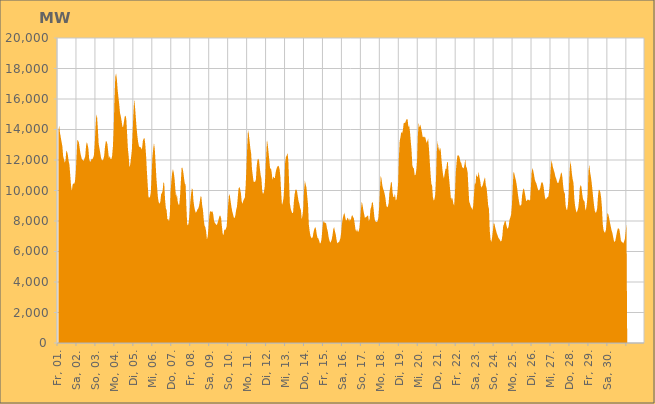
| Category | Series 0 |
|---|---|
|  Fr, 01.  | 13878.793 |
|  Fr, 01.  | 14262.089 |
|  Fr, 01.  | 13782.547 |
|  Fr, 01.  | 13492.274 |
|  Fr, 01.  | 13186.011 |
|  Fr, 01.  | 12915.115 |
|  Fr, 01.  | 12270.235 |
|  Fr, 01.  | 12058.289 |
|  Fr, 01.  | 11834.694 |
|  Fr, 01.  | 11949.019 |
|  Fr, 01.  | 12615.522 |
|  Fr, 01.  | 12539.215 |
|  Fr, 01.  | 12303.45 |
|  Fr, 01.  | 11924.206 |
|  Fr, 01.  | 11681.577 |
|  Fr, 01.  | 10993.734 |
|  Fr, 01.  | 10318.427 |
|  Sa, 02.  | 9981.906 |
|  Sa, 02.  | 10382.912 |
|  Sa, 02.  | 10466.688 |
|  Sa, 02.  | 10435.873 |
|  Sa, 02.  | 10596.642 |
|  Sa, 02.  | 11151.329 |
|  Sa, 02.  | 12265.621 |
|  Sa, 02.  | 13314.695 |
|  Sa, 02.  | 13261.381 |
|  Sa, 02.  | 13134.635 |
|  Sa, 02.  | 12749.764 |
|  Sa, 02.  | 12414.04 |
|  Sa, 02.  | 12193.676 |
|  Sa, 02.  | 12012.183 |
|  Sa, 02.  | 12009.718 |
|  Sa, 02.  | 11931.716 |
|  Sa, 02.  | 12099.205 |
|  Sa, 02.  | 12253.586 |
|  Sa, 02.  | 12917.688 |
|  Sa, 02.  | 13173.444 |
|  Sa, 02.  | 13007.349 |
|  Sa, 02.  | 12726.204 |
|  Sa, 02.  | 12055.014 |
|  Sa, 02.  | 11893.258 |
|  So, 03.  | 11910.158 |
|  So, 03.  | 12078.958 |
|  So, 03.  | 12052.947 |
|  So, 03.  | 12148.504 |
|  So, 03.  | 12324.542 |
|  So, 03.  | 13039.832 |
|  So, 03.  | 14130.231 |
|  So, 03.  | 14980.438 |
|  So, 03.  | 14805.828 |
|  So, 03.  | 14010.862 |
|  So, 03.  | 13047.624 |
|  So, 03.  | 12769.039 |
|  So, 03.  | 12459.73 |
|  So, 03.  | 12144.59 |
|  So, 03.  | 11993.905 |
|  So, 03.  | 11982.427 |
|  So, 03.  | 12061.313 |
|  So, 03.  | 12308.702 |
|  So, 03.  | 12871.593 |
|  So, 03.  | 13223.526 |
|  So, 03.  | 13226.489 |
|  So, 03.  | 13049.692 |
|  So, 03.  | 12576.939 |
|  So, 03.  | 12108.018 |
|  Mo, 04.  | 12264.677 |
|  Mo, 04.  | 12073.759 |
|  Mo, 04.  | 12056.805 |
|  Mo, 04.  | 12269.654 |
|  Mo, 04.  | 12882.707 |
|  Mo, 04.  | 14029.754 |
|  Mo, 04.  | 16017.393 |
|  Mo, 04.  | 17440.187 |
|  Mo, 04.  | 17683.174 |
|  Mo, 04.  | 17305.194 |
|  Mo, 04.  | 16607.957 |
|  Mo, 04.  | 16112.009 |
|  Mo, 04.  | 15649.054 |
|  Mo, 04.  | 15084.479 |
|  Mo, 04.  | 14859.195 |
|  Mo, 04.  | 14563.18 |
|  Mo, 04.  | 14182.592 |
|  Mo, 04.  | 14190.996 |
|  Mo, 04.  | 14517.901 |
|  Mo, 04.  | 14862.607 |
|  Mo, 04.  | 14918.051 |
|  Mo, 04.  | 14663.811 |
|  Mo, 04.  | 13697.328 |
|  Mo, 04.  | 12727.929 |
|  Di, 05.  | 12228.867 |
|  Di, 05.  | 11506.846 |
|  Di, 05.  | 11730.004 |
|  Di, 05.  | 12176.565 |
|  Di, 05.  | 12666.622 |
|  Di, 05.  | 13823.826 |
|  Di, 05.  | 15109.323 |
|  Di, 05.  | 15992.574 |
|  Di, 05.  | 15475.127 |
|  Di, 05.  | 14792.501 |
|  Di, 05.  | 14093.08 |
|  Di, 05.  | 13560.743 |
|  Di, 05.  | 13150.553 |
|  Di, 05.  | 12902.079 |
|  Di, 05.  | 12844.833 |
|  Di, 05.  | 12849.245 |
|  Di, 05.  | 12686.327 |
|  Di, 05.  | 12820.287 |
|  Di, 05.  | 13276.552 |
|  Di, 05.  | 13403.366 |
|  Di, 05.  | 13446.459 |
|  Di, 05.  | 13015.502 |
|  Di, 05.  | 12278.566 |
|  Di, 05.  | 11284.537 |
|  Mi, 06.  | 10424.678 |
|  Mi, 06.  | 9568.597 |
|  Mi, 06.  | 9530.845 |
|  Mi, 06.  | 9593.707 |
|  Mi, 06.  | 9879.379 |
|  Mi, 06.  | 10999.829 |
|  Mi, 06.  | 12201.949 |
|  Mi, 06.  | 12727.245 |
|  Mi, 06.  | 13124.298 |
|  Mi, 06.  | 12722.66 |
|  Mi, 06.  | 11855.66 |
|  Mi, 06.  | 10848.044 |
|  Mi, 06.  | 10173.688 |
|  Mi, 06.  | 9539.435 |
|  Mi, 06.  | 9228.161 |
|  Mi, 06.  | 9129.29 |
|  Mi, 06.  | 9260.17 |
|  Mi, 06.  | 9749.862 |
|  Mi, 06.  | 9836.662 |
|  Mi, 06.  | 10007.643 |
|  Mi, 06.  | 10570.447 |
|  Mi, 06.  | 10427.928 |
|  Mi, 06.  | 9416.909 |
|  Mi, 06.  | 8848.229 |
|  Do, 07.  | 8701.875 |
|  Do, 07.  | 8103.437 |
|  Do, 07.  | 8125.535 |
|  Do, 07.  | 7971.061 |
|  Do, 07.  | 8405.177 |
|  Do, 07.  | 9885.666 |
|  Do, 07.  | 10628.002 |
|  Do, 07.  | 11153.055 |
|  Do, 07.  | 11407.858 |
|  Do, 07.  | 11181.69 |
|  Do, 07.  | 10802.987 |
|  Do, 07.  | 10103.674 |
|  Do, 07.  | 9551.231 |
|  Do, 07.  | 9786.629 |
|  Do, 07.  | 9279.701 |
|  Do, 07.  | 9080.235 |
|  Do, 07.  | 9064.378 |
|  Do, 07.  | 9640.77 |
|  Do, 07.  | 10583.376 |
|  Do, 07.  | 11497.835 |
|  Do, 07.  | 11490.909 |
|  Do, 07.  | 11234.279 |
|  Do, 07.  | 10833.091 |
|  Do, 07.  | 10464.702 |
|  Fr, 08.  | 10380.371 |
|  Fr, 08.  | 8982.181 |
|  Fr, 08.  | 7785.064 |
|  Fr, 08.  | 7712.164 |
|  Fr, 08.  | 7916.336 |
|  Fr, 08.  | 8534.893 |
|  Fr, 08.  | 9265.348 |
|  Fr, 08.  | 9788.531 |
|  Fr, 08.  | 10139.305 |
|  Fr, 08.  | 10061.86 |
|  Fr, 08.  | 9311.184 |
|  Fr, 08.  | 8927.985 |
|  Fr, 08.  | 8674.39 |
|  Fr, 08.  | 8540.923 |
|  Fr, 08.  | 8619.9 |
|  Fr, 08.  | 8760.059 |
|  Fr, 08.  | 8818.282 |
|  Fr, 08.  | 8970.893 |
|  Fr, 08.  | 9287.665 |
|  Fr, 08.  | 9620.15 |
|  Fr, 08.  | 9583.345 |
|  Fr, 08.  | 9027.834 |
|  Fr, 08.  | 8720.358 |
|  Fr, 08.  | 8074.746 |
|  Sa, 09.  | 7694.762 |
|  Sa, 09.  | 7607.412 |
|  Sa, 09.  | 7306.518 |
|  Sa, 09.  | 6783.632 |
|  Sa, 09.  | 6980.554 |
|  Sa, 09.  | 7564.844 |
|  Sa, 09.  | 8325.684 |
|  Sa, 09.  | 8653.022 |
|  Sa, 09.  | 8599.771 |
|  Sa, 09.  | 8606.216 |
|  Sa, 09.  | 8639.487 |
|  Sa, 09.  | 8425.367 |
|  Sa, 09.  | 8024.201 |
|  Sa, 09.  | 7875.035 |
|  Sa, 09.  | 7824.452 |
|  Sa, 09.  | 7726.695 |
|  Sa, 09.  | 7797.543 |
|  Sa, 09.  | 7948.087 |
|  Sa, 09.  | 8163.895 |
|  Sa, 09.  | 8341.718 |
|  Sa, 09.  | 8353.35 |
|  Sa, 09.  | 8168.707 |
|  Sa, 09.  | 7639.524 |
|  Sa, 09.  | 7147.979 |
|  So, 10.  | 7075.109 |
|  So, 10.  | 7439.843 |
|  So, 10.  | 7407.064 |
|  So, 10.  | 7490.918 |
|  So, 10.  | 7657.119 |
|  So, 10.  | 8331.148 |
|  So, 10.  | 9153.716 |
|  So, 10.  | 9764.235 |
|  So, 10.  | 9659.255 |
|  So, 10.  | 9304.538 |
|  So, 10.  | 8942.842 |
|  So, 10.  | 8638.061 |
|  So, 10.  | 8450.774 |
|  So, 10.  | 8229.961 |
|  So, 10.  | 8187.343 |
|  So, 10.  | 8362.675 |
|  So, 10.  | 8724.143 |
|  So, 10.  | 8926.71 |
|  So, 10.  | 9504.825 |
|  So, 10.  | 10116.502 |
|  So, 10.  | 10240.33 |
|  So, 10.  | 10101.506 |
|  So, 10.  | 9809.419 |
|  So, 10.  | 9290.476 |
|  Mo, 11.  | 9123.875 |
|  Mo, 11.  | 9322.253 |
|  Mo, 11.  | 9446.824 |
|  Mo, 11.  | 9528.029 |
|  Mo, 11.  | 10290.374 |
|  Mo, 11.  | 11450.181 |
|  Mo, 11.  | 12825.83 |
|  Mo, 11.  | 13973.389 |
|  Mo, 11.  | 13718.21 |
|  Mo, 11.  | 13233.425 |
|  Mo, 11.  | 12761.831 |
|  Mo, 11.  | 12415.3 |
|  Mo, 11.  | 11422.371 |
|  Mo, 11.  | 11009.799 |
|  Mo, 11.  | 10591.064 |
|  Mo, 11.  | 10559.94 |
|  Mo, 11.  | 10576.133 |
|  Mo, 11.  | 10727.268 |
|  Mo, 11.  | 11593.619 |
|  Mo, 11.  | 12014.872 |
|  Mo, 11.  | 12091.426 |
|  Mo, 11.  | 11945.319 |
|  Mo, 11.  | 11451.173 |
|  Mo, 11.  | 11015.615 |
|  Di, 12.  | 10763.218 |
|  Di, 12.  | 9984.882 |
|  Di, 12.  | 9766.249 |
|  Di, 12.  | 9883.425 |
|  Di, 12.  | 10194.086 |
|  Di, 12.  | 11027.584 |
|  Di, 12.  | 12258.612 |
|  Di, 12.  | 13338.929 |
|  Di, 12.  | 12996.822 |
|  Di, 12.  | 12504.914 |
|  Di, 12.  | 11973.752 |
|  Di, 12.  | 11409.624 |
|  Di, 12.  | 11483.176 |
|  Di, 12.  | 11170.59 |
|  Di, 12.  | 10678.929 |
|  Di, 12.  | 10927.118 |
|  Di, 12.  | 10816.101 |
|  Di, 12.  | 10829.742 |
|  Di, 12.  | 11191.431 |
|  Di, 12.  | 11407.593 |
|  Di, 12.  | 11547.532 |
|  Di, 12.  | 11628.586 |
|  Di, 12.  | 11587.066 |
|  Di, 12.  | 11391.262 |
|  Mi, 13.  | 10884.308 |
|  Mi, 13.  | 9850.574 |
|  Mi, 13.  | 9047.109 |
|  Mi, 13.  | 9224.856 |
|  Mi, 13.  | 9524.16 |
|  Mi, 13.  | 10418.439 |
|  Mi, 13.  | 11830.568 |
|  Mi, 13.  | 12203.712 |
|  Mi, 13.  | 12289.993 |
|  Mi, 13.  | 12470.162 |
|  Mi, 13.  | 12004.8 |
|  Mi, 13.  | 10550.582 |
|  Mi, 13.  | 9151.515 |
|  Mi, 13.  | 8824.879 |
|  Mi, 13.  | 8643.314 |
|  Mi, 13.  | 8525.215 |
|  Mi, 13.  | 8532.066 |
|  Mi, 13.  | 9223.12 |
|  Mi, 13.  | 9743.19 |
|  Mi, 13.  | 10043.684 |
|  Mi, 13.  | 10068.863 |
|  Mi, 13.  | 9973.336 |
|  Mi, 13.  | 9626.043 |
|  Mi, 13.  | 9306.637 |
|  Do, 14.  | 9131.103 |
|  Do, 14.  | 8852.848 |
|  Do, 14.  | 8713.074 |
|  Do, 14.  | 8104.138 |
|  Do, 14.  | 8397.09 |
|  Do, 14.  | 8826.412 |
|  Do, 14.  | 10052.652 |
|  Do, 14.  | 10648.408 |
|  Do, 14.  | 10390 |
|  Do, 14.  | 10185.86 |
|  Do, 14.  | 9602.249 |
|  Do, 14.  | 9056.028 |
|  Do, 14.  | 7762.339 |
|  Do, 14.  | 7338.079 |
|  Do, 14.  | 7029.397 |
|  Do, 14.  | 6918.846 |
|  Do, 14.  | 6868.352 |
|  Do, 14.  | 6968.201 |
|  Do, 14.  | 7289.105 |
|  Do, 14.  | 7479.787 |
|  Do, 14.  | 7608.573 |
|  Do, 14.  | 7484.837 |
|  Do, 14.  | 7139.466 |
|  Do, 14.  | 6894.924 |
|  Fr, 15.  | 6858.177 |
|  Fr, 15.  | 6711.761 |
|  Fr, 15.  | 6529.647 |
|  Fr, 15.  | 6560.545 |
|  Fr, 15.  | 6792.334 |
|  Fr, 15.  | 7373.721 |
|  Fr, 15.  | 7872.925 |
|  Fr, 15.  | 8010.175 |
|  Fr, 15.  | 7879.237 |
|  Fr, 15.  | 7893.723 |
|  Fr, 15.  | 7823.88 |
|  Fr, 15.  | 7513.152 |
|  Fr, 15.  | 7313.953 |
|  Fr, 15.  | 6957.832 |
|  Fr, 15.  | 6733.066 |
|  Fr, 15.  | 6576.567 |
|  Fr, 15.  | 6652.041 |
|  Fr, 15.  | 6784.479 |
|  Fr, 15.  | 7082.183 |
|  Fr, 15.  | 7468.007 |
|  Fr, 15.  | 7599.214 |
|  Fr, 15.  | 7342.38 |
|  Fr, 15.  | 7134.654 |
|  Fr, 15.  | 6793.598 |
|  Sa, 16.  | 6529.03 |
|  Sa, 16.  | 6601.932 |
|  Sa, 16.  | 6597.453 |
|  Sa, 16.  | 6717.179 |
|  Sa, 16.  | 6890.289 |
|  Sa, 16.  | 7275.706 |
|  Sa, 16.  | 7856.538 |
|  Sa, 16.  | 8197.759 |
|  Sa, 16.  | 8408.186 |
|  Sa, 16.  | 8537.109 |
|  Sa, 16.  | 8284.173 |
|  Sa, 16.  | 8010.8 |
|  Sa, 16.  | 8081.432 |
|  Sa, 16.  | 8224.388 |
|  Sa, 16.  | 8145.306 |
|  Sa, 16.  | 7984.311 |
|  Sa, 16.  | 8178.302 |
|  Sa, 16.  | 8030.222 |
|  Sa, 16.  | 8288.986 |
|  Sa, 16.  | 8389.107 |
|  Sa, 16.  | 8259.21 |
|  Sa, 16.  | 8174.048 |
|  Sa, 16.  | 7851.515 |
|  Sa, 16.  | 7464.026 |
|  So, 17.  | 7300.694 |
|  So, 17.  | 7477.814 |
|  So, 17.  | 7295.376 |
|  So, 17.  | 7314.482 |
|  So, 17.  | 7541.82 |
|  So, 17.  | 8098.689 |
|  So, 17.  | 8799.731 |
|  So, 17.  | 9277.792 |
|  So, 17.  | 9051.577 |
|  So, 17.  | 8715.29 |
|  So, 17.  | 8461.219 |
|  So, 17.  | 8198.083 |
|  So, 17.  | 8252.134 |
|  So, 17.  | 8275.025 |
|  So, 17.  | 8348.236 |
|  So, 17.  | 8356.471 |
|  So, 17.  | 8006.042 |
|  So, 17.  | 8156.269 |
|  So, 17.  | 8771.613 |
|  So, 17.  | 8922.097 |
|  So, 17.  | 9238.214 |
|  So, 17.  | 9214.834 |
|  So, 17.  | 8770.331 |
|  So, 17.  | 8233.796 |
|  Mo, 18.  | 7984.632 |
|  Mo, 18.  | 7947.45 |
|  Mo, 18.  | 7934.609 |
|  Mo, 18.  | 7981.382 |
|  Mo, 18.  | 8228.205 |
|  Mo, 18.  | 8911.771 |
|  Mo, 18.  | 10090.215 |
|  Mo, 18.  | 10992.12 |
|  Mo, 18.  | 10758.478 |
|  Mo, 18.  | 10345.019 |
|  Mo, 18.  | 10114.712 |
|  Mo, 18.  | 9985.004 |
|  Mo, 18.  | 9773.396 |
|  Mo, 18.  | 9489.431 |
|  Mo, 18.  | 9029.87 |
|  Mo, 18.  | 8903.407 |
|  Mo, 18.  | 8944.93 |
|  Mo, 18.  | 9159.938 |
|  Mo, 18.  | 9855.359 |
|  Mo, 18.  | 10186.799 |
|  Mo, 18.  | 10561.396 |
|  Mo, 18.  | 10530.764 |
|  Mo, 18.  | 9872.132 |
|  Mo, 18.  | 9567.233 |
|  Di, 19.  | 9565.865 |
|  Di, 19.  | 9791.637 |
|  Di, 19.  | 9344.009 |
|  Di, 19.  | 9420.355 |
|  Di, 19.  | 9803.385 |
|  Di, 19.  | 10448.817 |
|  Di, 19.  | 12190.407 |
|  Di, 19.  | 13268.659 |
|  Di, 19.  | 13482.144 |
|  Di, 19.  | 13857.86 |
|  Di, 19.  | 13738.638 |
|  Di, 19.  | 13932.666 |
|  Di, 19.  | 14398.899 |
|  Di, 19.  | 14430.911 |
|  Di, 19.  | 14447.332 |
|  Di, 19.  | 14590.464 |
|  Di, 19.  | 14689.286 |
|  Di, 19.  | 14662.807 |
|  Di, 19.  | 14175.254 |
|  Di, 19.  | 14260.563 |
|  Di, 19.  | 13873.096 |
|  Di, 19.  | 13222.956 |
|  Di, 19.  | 12645.06 |
|  Di, 19.  | 11660.897 |
|  Mi, 20.  | 11490.981 |
|  Mi, 20.  | 11433.824 |
|  Mi, 20.  | 10998.198 |
|  Mi, 20.  | 11017.797 |
|  Mi, 20.  | 11312.591 |
|  Mi, 20.  | 11959.767 |
|  Mi, 20.  | 13583.493 |
|  Mi, 20.  | 14442.563 |
|  Mi, 20.  | 14133.175 |
|  Mi, 20.  | 14330.177 |
|  Mi, 20.  | 14118.001 |
|  Mi, 20.  | 13871.206 |
|  Mi, 20.  | 13515.712 |
|  Mi, 20.  | 13534.718 |
|  Mi, 20.  | 13467.479 |
|  Mi, 20.  | 13544.408 |
|  Mi, 20.  | 13353.909 |
|  Mi, 20.  | 13115.661 |
|  Mi, 20.  | 13233.294 |
|  Mi, 20.  | 13396.811 |
|  Mi, 20.  | 12787.883 |
|  Mi, 20.  | 11951.673 |
|  Mi, 20.  | 11133.392 |
|  Mi, 20.  | 10458.834 |
|  Do, 21.  | 10322.614 |
|  Do, 21.  | 9586.126 |
|  Do, 21.  | 9347.388 |
|  Do, 21.  | 9425.641 |
|  Do, 21.  | 9724.601 |
|  Do, 21.  | 10782.515 |
|  Do, 21.  | 12541.703 |
|  Do, 21.  | 13235.861 |
|  Do, 21.  | 12845.875 |
|  Do, 21.  | 12580.787 |
|  Do, 21.  | 12830.231 |
|  Do, 21.  | 12632.402 |
|  Do, 21.  | 11954.924 |
|  Do, 21.  | 11413.227 |
|  Do, 21.  | 10997.786 |
|  Do, 21.  | 10796.008 |
|  Do, 21.  | 11119.645 |
|  Do, 21.  | 11435.325 |
|  Do, 21.  | 11399.42 |
|  Do, 21.  | 11847.312 |
|  Do, 21.  | 11855.085 |
|  Do, 21.  | 11078.472 |
|  Do, 21.  | 10521.004 |
|  Do, 21.  | 9968.358 |
|  Fr, 22.  | 9380.694 |
|  Fr, 22.  | 9550.23 |
|  Fr, 22.  | 9416.139 |
|  Fr, 22.  | 9123.462 |
|  Fr, 22.  | 9024.038 |
|  Fr, 22.  | 9877.034 |
|  Fr, 22.  | 11186.77 |
|  Fr, 22.  | 11835.344 |
|  Fr, 22.  | 12278.054 |
|  Fr, 22.  | 12306.248 |
|  Fr, 22.  | 12283.466 |
|  Fr, 22.  | 12119.38 |
|  Fr, 22.  | 11858.381 |
|  Fr, 22.  | 11799.433 |
|  Fr, 22.  | 11539.958 |
|  Fr, 22.  | 11485.291 |
|  Fr, 22.  | 11455.104 |
|  Fr, 22.  | 11673.925 |
|  Fr, 22.  | 12060.923 |
|  Fr, 22.  | 11575.366 |
|  Fr, 22.  | 11470.362 |
|  Fr, 22.  | 11173.766 |
|  Fr, 22.  | 10166.721 |
|  Fr, 22.  | 9248.657 |
|  Sa, 23.  | 9137.62 |
|  Sa, 23.  | 8935.695 |
|  Sa, 23.  | 8865.655 |
|  Sa, 23.  | 8731.691 |
|  Sa, 23.  | 8980.116 |
|  Sa, 23.  | 9682.378 |
|  Sa, 23.  | 10462.206 |
|  Sa, 23.  | 10442.994 |
|  Sa, 23.  | 11103.613 |
|  Sa, 23.  | 10878.608 |
|  Sa, 23.  | 10938.841 |
|  Sa, 23.  | 11233.199 |
|  Sa, 23.  | 10866.083 |
|  Sa, 23.  | 10611.698 |
|  Sa, 23.  | 10190.49 |
|  Sa, 23.  | 10259.034 |
|  Sa, 23.  | 10335.77 |
|  Sa, 23.  | 10538.106 |
|  Sa, 23.  | 10733.216 |
|  Sa, 23.  | 10870.609 |
|  Sa, 23.  | 10351.38 |
|  Sa, 23.  | 10162.689 |
|  Sa, 23.  | 9633.979 |
|  Sa, 23.  | 9010.514 |
|  So, 24.  | 8793.779 |
|  So, 24.  | 7369.515 |
|  So, 24.  | 6774.659 |
|  So, 24.  | 6629.524 |
|  So, 24.  | 6929.308 |
|  So, 24.  | 7372.679 |
|  So, 24.  | 7870.441 |
|  So, 24.  | 7815.277 |
|  So, 24.  | 7558.579 |
|  So, 24.  | 7369.296 |
|  So, 24.  | 7179.498 |
|  So, 24.  | 7043.126 |
|  So, 24.  | 6892.335 |
|  So, 24.  | 6829.34 |
|  So, 24.  | 6735.333 |
|  So, 24.  | 6658.148 |
|  So, 24.  | 6715.093 |
|  So, 24.  | 7035.993 |
|  So, 24.  | 7671.262 |
|  So, 24.  | 7793.623 |
|  So, 24.  | 7983.289 |
|  So, 24.  | 8010.869 |
|  So, 24.  | 7744.048 |
|  So, 24.  | 7527.872 |
|  Mo, 25.  | 7505.099 |
|  Mo, 25.  | 7675.002 |
|  Mo, 25.  | 8080.753 |
|  Mo, 25.  | 8228.403 |
|  Mo, 25.  | 8416.239 |
|  Mo, 25.  | 9013.102 |
|  Mo, 25.  | 10073.37 |
|  Mo, 25.  | 11238.764 |
|  Mo, 25.  | 11142.533 |
|  Mo, 25.  | 10889.881 |
|  Mo, 25.  | 10696.168 |
|  Mo, 25.  | 10399.909 |
|  Mo, 25.  | 10040.351 |
|  Mo, 25.  | 9626.742 |
|  Mo, 25.  | 9293.746 |
|  Mo, 25.  | 9009.798 |
|  Mo, 25.  | 9018.572 |
|  Mo, 25.  | 9083.223 |
|  Mo, 25.  | 9700.766 |
|  Mo, 25.  | 10011.864 |
|  Mo, 25.  | 10156.988 |
|  Mo, 25.  | 9960.457 |
|  Mo, 25.  | 9660.863 |
|  Mo, 25.  | 9326.77 |
|  Di, 26.  | 9326.16 |
|  Di, 26.  | 9417.581 |
|  Di, 26.  | 9382.108 |
|  Di, 26.  | 9393.931 |
|  Di, 26.  | 9315.798 |
|  Di, 26.  | 10162.387 |
|  Di, 26.  | 11146.704 |
|  Di, 26.  | 11471.889 |
|  Di, 26.  | 11306.921 |
|  Di, 26.  | 11044.422 |
|  Di, 26.  | 10716.266 |
|  Di, 26.  | 10567.057 |
|  Di, 26.  | 10455.767 |
|  Di, 26.  | 10271.402 |
|  Di, 26.  | 10076.389 |
|  Di, 26.  | 9986.303 |
|  Di, 26.  | 10050.924 |
|  Di, 26.  | 10183.381 |
|  Di, 26.  | 10457.351 |
|  Di, 26.  | 10560.384 |
|  Di, 26.  | 10508.899 |
|  Di, 26.  | 10309.371 |
|  Di, 26.  | 9877.679 |
|  Di, 26.  | 9533.799 |
|  Mi, 27.  | 9398.711 |
|  Mi, 27.  | 9500.731 |
|  Mi, 27.  | 9559.838 |
|  Mi, 27.  | 9579.104 |
|  Mi, 27.  | 9885.477 |
|  Mi, 27.  | 10351.416 |
|  Mi, 27.  | 11319.233 |
|  Mi, 27.  | 11977.691 |
|  Mi, 27.  | 11789.741 |
|  Mi, 27.  | 11510.374 |
|  Mi, 27.  | 11346.409 |
|  Mi, 27.  | 11172.258 |
|  Mi, 27.  | 10927.018 |
|  Mi, 27.  | 10794.41 |
|  Mi, 27.  | 10605.478 |
|  Mi, 27.  | 10477.522 |
|  Mi, 27.  | 10515.904 |
|  Mi, 27.  | 10695.767 |
|  Mi, 27.  | 10873.216 |
|  Mi, 27.  | 11120.068 |
|  Mi, 27.  | 11181.304 |
|  Mi, 27.  | 10843.398 |
|  Mi, 27.  | 10260.05 |
|  Mi, 27.  | 9884.374 |
|  Do, 28.  | 9837.274 |
|  Do, 28.  | 9037.701 |
|  Do, 28.  | 8752.355 |
|  Do, 28.  | 8733.308 |
|  Do, 28.  | 9097.817 |
|  Do, 28.  | 9854.198 |
|  Do, 28.  | 11207.405 |
|  Do, 28.  | 11934.468 |
|  Do, 28.  | 11598.67 |
|  Do, 28.  | 11086.571 |
|  Do, 28.  | 10719.237 |
|  Do, 28.  | 10489.941 |
|  Do, 28.  | 9484.273 |
|  Do, 28.  | 8992.476 |
|  Do, 28.  | 8717.606 |
|  Do, 28.  | 8547.924 |
|  Do, 28.  | 8682.157 |
|  Do, 28.  | 8873.412 |
|  Do, 28.  | 9339.532 |
|  Do, 28.  | 10164.841 |
|  Do, 28.  | 10359.409 |
|  Do, 28.  | 10248.776 |
|  Do, 28.  | 9784.218 |
|  Do, 28.  | 9453.887 |
|  Fr, 29.  | 9335.19 |
|  Fr, 29.  | 9278.262 |
|  Fr, 29.  | 8704.288 |
|  Fr, 29.  | 8816.997 |
|  Fr, 29.  | 9201.902 |
|  Fr, 29.  | 9765.518 |
|  Fr, 29.  | 11254.069 |
|  Fr, 29.  | 11701.722 |
|  Fr, 29.  | 11203.119 |
|  Fr, 29.  | 10906.775 |
|  Fr, 29.  | 10515.272 |
|  Fr, 29.  | 10010.245 |
|  Fr, 29.  | 9493.261 |
|  Fr, 29.  | 9030.211 |
|  Fr, 29.  | 8668.236 |
|  Fr, 29.  | 8533.167 |
|  Fr, 29.  | 8602.385 |
|  Fr, 29.  | 8838.699 |
|  Fr, 29.  | 9646.878 |
|  Fr, 29.  | 10053.813 |
|  Fr, 29.  | 10027.567 |
|  Fr, 29.  | 9880.433 |
|  Fr, 29.  | 9509.54 |
|  Fr, 29.  | 8898.756 |
|  Sa, 30.  | 7806.577 |
|  Sa, 30.  | 7409.798 |
|  Sa, 30.  | 7271.17 |
|  Sa, 30.  | 7246.713 |
|  Sa, 30.  | 7409.088 |
|  Sa, 30.  | 7918.19 |
|  Sa, 30.  | 8541.493 |
|  Sa, 30.  | 8444.563 |
|  Sa, 30.  | 8222.907 |
|  Sa, 30.  | 7929.709 |
|  Sa, 30.  | 7684.769 |
|  Sa, 30.  | 7425.875 |
|  Sa, 30.  | 7258.067 |
|  Sa, 30.  | 7012.589 |
|  Sa, 30.  | 6729.726 |
|  Sa, 30.  | 6610.453 |
|  Sa, 30.  | 6721.573 |
|  Sa, 30.  | 7000.313 |
|  Sa, 30.  | 7270.08 |
|  Sa, 30.  | 7500.259 |
|  Sa, 30.  | 7521.577 |
|  Sa, 30.  | 7453.604 |
|  Sa, 30.  | 7121.627 |
|  Sa, 30.  | 6726.312 |
|  So, 01.  | 6638.102 |
|  So, 01.  | 6602.036 |
|  So, 01.  | 6520.977 |
|  So, 01.  | 6663.102 |
|  So, 01.  | 6816.186 |
|  So, 01.  | 7285.076 |
|    | 7752.444 |
|    | 0 |
|    | 0 |
|    | 0 |
|    | 0 |
|    | 0 |
|    | 0 |
|    | 0 |
|    | 0 |
|    | 0 |
|    | 0 |
|    | 0 |
|    | 0 |
|    | 0 |
|    | 0 |
|    | 0 |
|    | 0 |
|    | 0 |
|    | 0 |
|    | 0 |
|    | 0 |
|    | 0 |
|    | 0 |
|    | 0 |